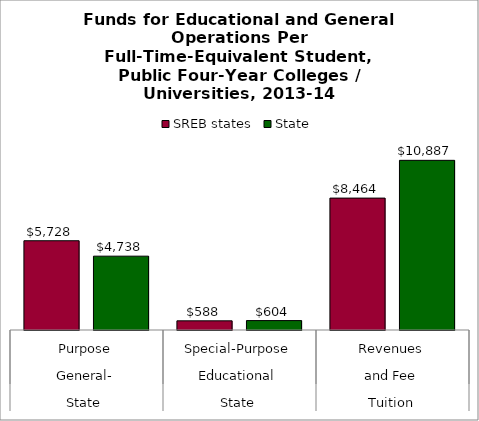
| Category | SREB states | State |
|---|---|---|
| 0 | 5727.702 | 4738.067 |
| 1 | 588.457 | 603.854 |
| 2 | 8463.632 | 10887.107 |